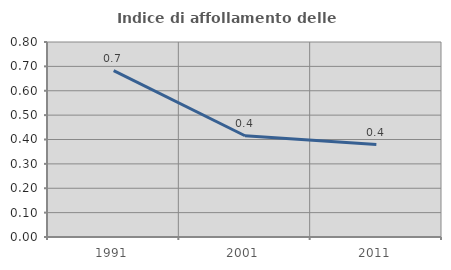
| Category | Indice di affollamento delle abitazioni  |
|---|---|
| 1991.0 | 0.682 |
| 2001.0 | 0.415 |
| 2011.0 | 0.379 |